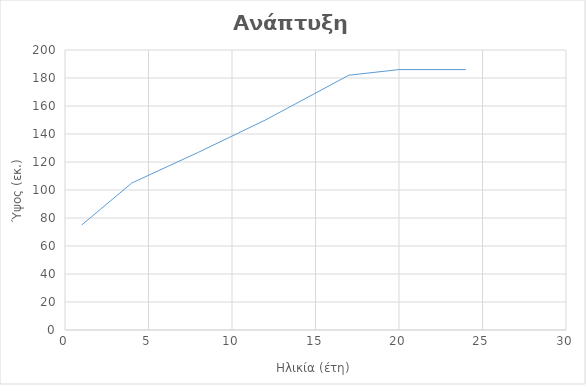
| Category | Ύψος (εκ.) |
|---|---|
| 1.0 | 75 |
| 4.0 | 105 |
| 8.0 | 127 |
| 12.0 | 150 |
| 17.0 | 182 |
| 20.0 | 186 |
| 24.0 | 186 |